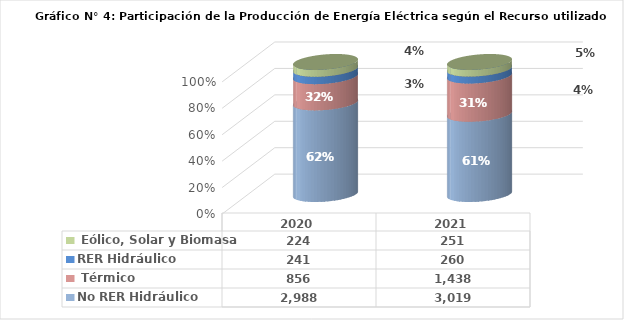
| Category | No RER | RER |
|---|---|---|
| 2020.0 | 855.596 | 223.786 |
| 2021.0 | 1437.716 | 250.809 |